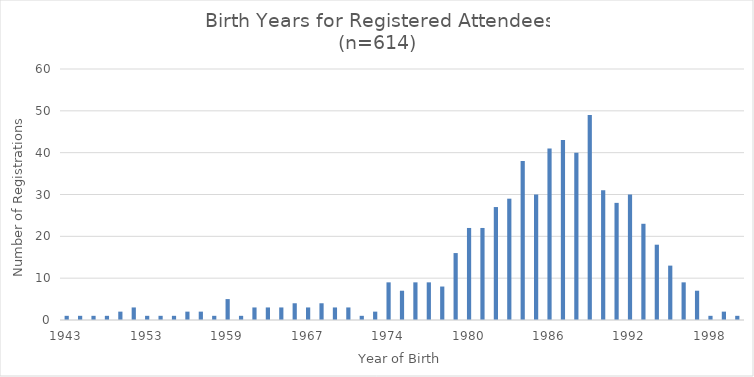
| Category | Frequency |
|---|---|
| 1943.0 | 1 |
| 1945.0 | 1 |
| 1946.0 | 1 |
| 1949.0 | 1 |
| 1950.0 | 2 |
| 1952.0 | 3 |
| 1953.0 | 1 |
| 1954.0 | 1 |
| 1955.0 | 1 |
| 1956.0 | 2 |
| 1957.0 | 2 |
| 1958.0 | 1 |
| 1959.0 | 5 |
| 1960.0 | 1 |
| 1963.0 | 3 |
| 1964.0 | 3 |
| 1965.0 | 3 |
| 1966.0 | 4 |
| 1967.0 | 3 |
| 1968.0 | 4 |
| 1969.0 | 3 |
| 1970.0 | 3 |
| 1971.0 | 1 |
| 1973.0 | 2 |
| 1974.0 | 9 |
| 1975.0 | 7 |
| 1976.0 | 9 |
| 1977.0 | 9 |
| 1978.0 | 8 |
| 1979.0 | 16 |
| 1980.0 | 22 |
| 1981.0 | 22 |
| 1982.0 | 27 |
| 1983.0 | 29 |
| 1984.0 | 38 |
| 1985.0 | 30 |
| 1986.0 | 41 |
| 1987.0 | 43 |
| 1988.0 | 40 |
| 1989.0 | 49 |
| 1990.0 | 31 |
| 1991.0 | 28 |
| 1992.0 | 30 |
| 1993.0 | 23 |
| 1994.0 | 18 |
| 1995.0 | 13 |
| 1996.0 | 9 |
| 1997.0 | 7 |
| 1998.0 | 1 |
| 1999.0 | 2 |
| 2000.0 | 1 |